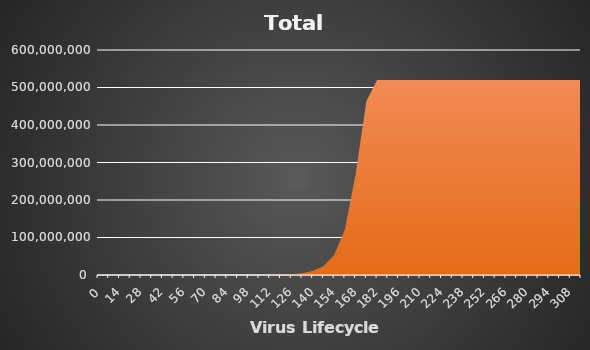
| Category | Total Deaths |
|---|---|
| 0.0 | 0.04 |
| 7.0 | 0.246 |
| 14.0 | 0.793 |
| 21.0 | 2.231 |
| 28.0 | 5.985 |
| 35.0 | 15.705 |
| 42.0 | 40.685 |
| 49.0 | 104.381 |
| 56.0 | 265.526 |
| 63.0 | 669.994 |
| 70.0 | 1677.119 |
| 77.0 | 4164.759 |
| 84.0 | 10259.677 |
| 91.0 | 25071.068 |
| 98.0 | 60768.929 |
| 105.0 | 146094.101 |
| 112.0 | 348335.742 |
| 119.0 | 823661.856 |
| 126.0 | 1931328.836 |
| 133.0 | 4490453.209 |
| 140.0 | 10351914.327 |
| 147.0 | 23660128.806 |
| 154.0 | 53610321.41 |
| 161.0 | 120415679.292 |
| 168.0 | 268095150.508 |
| 175.0 | 463525176.145 |
| 182.0 | 520059234.018 |
| 189.0 | 520059234.018 |
| 196.0 | 520059234.018 |
| 203.0 | 520059234.018 |
| 210.0 | 520059234.018 |
| 217.0 | 520059234.018 |
| 224.0 | 520059234.018 |
| 231.0 | 520059234.018 |
| 238.0 | 520059234.018 |
| 245.0 | 520059234.018 |
| 252.0 | 520059234.018 |
| 259.0 | 520059234.018 |
| 266.0 | 520059234.018 |
| 273.0 | 520059234.018 |
| 280.0 | 520059234.018 |
| 287.0 | 520059234.018 |
| 294.0 | 520059234.018 |
| 301.0 | 520059234.018 |
| 308.0 | 520059234.018 |
| 315.0 | 520059234.018 |